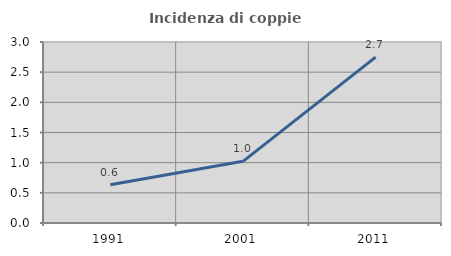
| Category | Incidenza di coppie miste |
|---|---|
| 1991.0 | 0.633 |
| 2001.0 | 1.022 |
| 2011.0 | 2.748 |